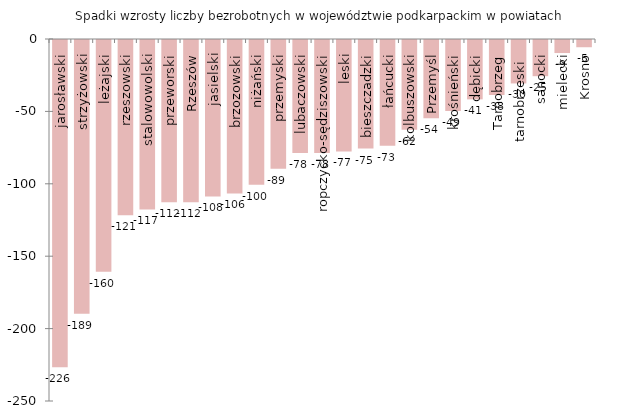
| Category | Spadki wzrosty liczba bezrobotnych w województwie podkarpackim wg powiatów |
|---|---|
| jarosławski | -226 |
| strzyżowski | -189 |
| leżajski | -160 |
| rzeszowski | -121 |
| stalowowolski | -117 |
| przeworski | -112 |
| Rzeszów | -112 |
| jasielski | -108 |
| brzozowski | -106 |
| niżański | -100 |
| przemyski | -89 |
| lubaczowski | -78 |
| ropczycko-sędziszowski | -78 |
| leski | -77 |
| bieszczadzki | -75 |
| łańcucki | -73 |
| kolbuszowski | -62 |
| Przemyśl | -54 |
| krośnieński | -49 |
| dębicki | -41 |
| Tarnobrzeg | -38 |
| tarnobrzeski  | -30 |
| sanocki | -25 |
| mielecki | -9 |
| Krosno | -5 |